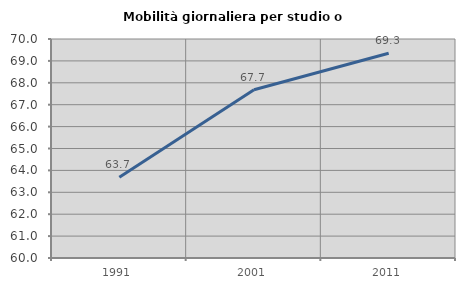
| Category | Mobilità giornaliera per studio o lavoro |
|---|---|
| 1991.0 | 63.688 |
| 2001.0 | 67.681 |
| 2011.0 | 69.348 |